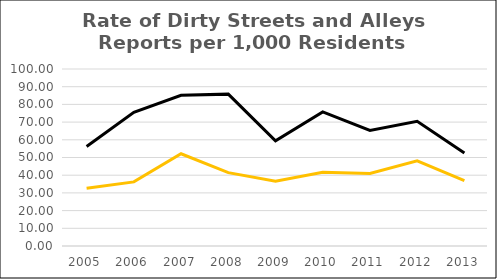
| Category | Rate of Dirty Streets and Alleys Reports per 1,000 Residents |
|---|---|
| 2005.0 | 56.25 |
| 2006.0 | 75.539 |
| 2007.0 | 85.119 |
| 2008.0 | 85.803 |
| 2009.0 | 59.468 |
| 2010.0 | 75.77 |
| 2011.0 | 65.292 |
| 2012.0 | 70.481 |
| 2013.0 | 52.554 |